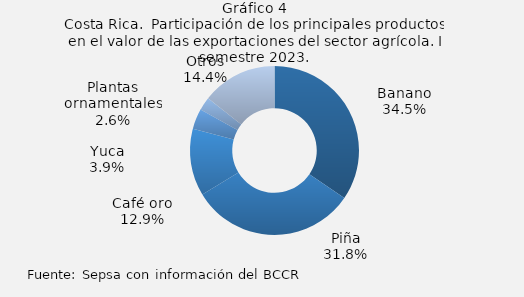
| Category | Series 0 |
|---|---|
| Banano | 624415.621 |
| Piña | 574369.44 |
| Café oro | 232868.023 |
| Yuca | 70010.443 |
| Plantas ornamentales | 46327.462 |
| Otros | 260432.685 |